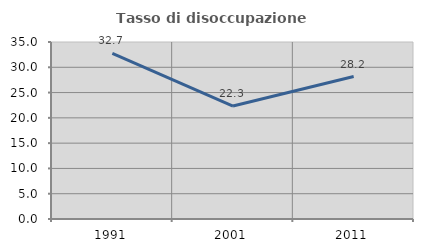
| Category | Tasso di disoccupazione giovanile  |
|---|---|
| 1991.0 | 32.748 |
| 2001.0 | 22.333 |
| 2011.0 | 28.178 |